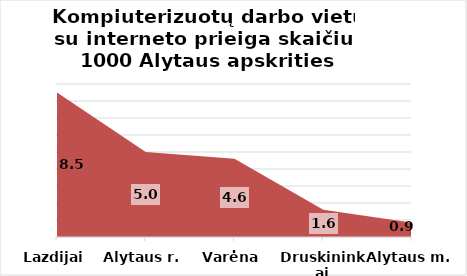
| Category | Series 0 |
|---|---|
| Lazdijai | 8.5 |
| Alytaus r. | 5 |
| Varėna | 4.6 |
| Druskininkai | 1.6 |
| Alytaus m. | 0.85 |